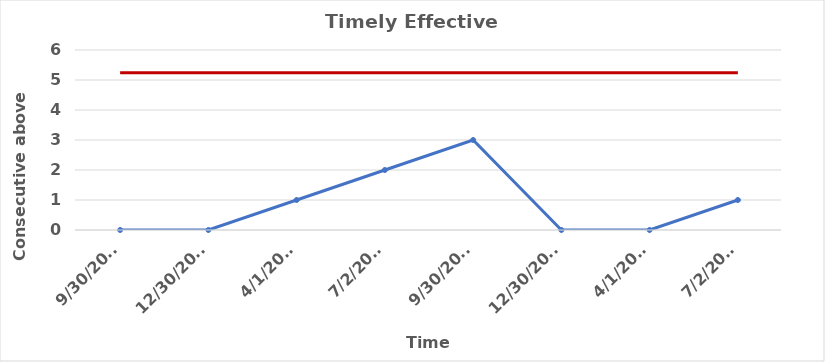
| Category | UCL | Consecutive above benchmark |
|---|---|---|
| 9/30/13 | 5.243 | 0 |
| 12/30/13 | 5.243 | 0 |
| 4/1/14 | 5.243 | 1 |
| 7/2/14 | 5.243 | 2 |
| 9/30/14 | 5.243 | 3 |
| 12/30/14 | 5.243 | 0 |
| 4/1/15 | 5.243 | 0 |
| 7/2/15 | 5.243 | 1 |